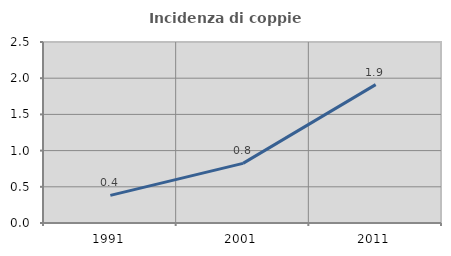
| Category | Incidenza di coppie miste |
|---|---|
| 1991.0 | 0.381 |
| 2001.0 | 0.824 |
| 2011.0 | 1.911 |